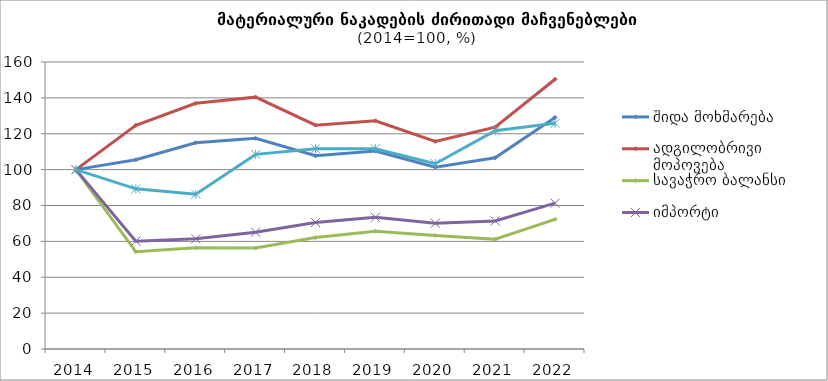
| Category | შიდა მოხმარება | ადგილობრივი მოპოვება | სავაჭრო ბალანსი | იმპორტი | ექსპორტი |
|---|---|---|---|---|---|
| 2014.0 | 100 | 100 | 100 | 100 | 100 |
| 2015.0 | 105.5 | 124.7 | 54.2 | 60.1 | 89.3 |
| 2016.0 | 115 | 137 | 56.4 | 61.4 | 86.3 |
| 2017.0 | 117.5 | 140.4 | 56.3 | 65.1 | 108.5 |
| 2018.0 | 107.7 | 124.8 | 62.1 | 70.5 | 111.6 |
| 2019.0 | 110.4 | 127.2 | 65.7 | 73.4 | 111.6 |
| 2020.0 | 101.4 | 115.7 | 63.3 | 70.1 | 103.3 |
| 2021.0 | 106.6 | 123.7 | 61.2 | 71.4 | 121.7 |
| 2022.0 | 129.1 | 150.4 | 72.3 | 81.3 | 125.8 |